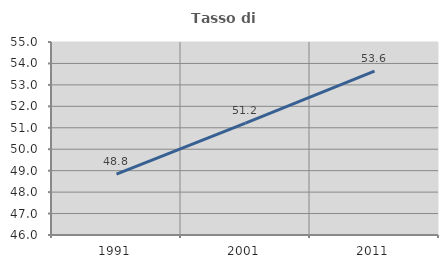
| Category | Tasso di occupazione   |
|---|---|
| 1991.0 | 48.838 |
| 2001.0 | 51.221 |
| 2011.0 | 53.647 |